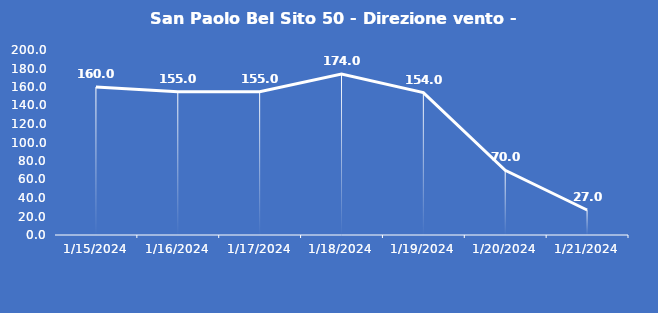
| Category | San Paolo Bel Sito 50 - Direzione vento - Grezzo (°N) |
|---|---|
| 1/15/24 | 160 |
| 1/16/24 | 155 |
| 1/17/24 | 155 |
| 1/18/24 | 174 |
| 1/19/24 | 154 |
| 1/20/24 | 70 |
| 1/21/24 | 27 |